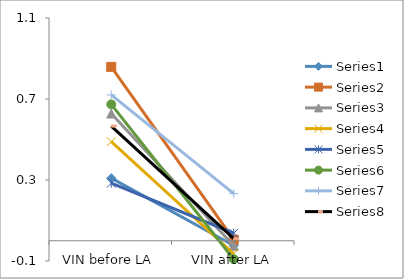
| Category | Series 0 | Series 1 | Series 2 | Series 3 | Series 4 | Series 5 | Series 6 | Series 7 |
|---|---|---|---|---|---|---|---|---|
| VIN before LA | 0.309 | 0.859 | 0.628 | 0.49 | 0.284 | 0.674 | 0.72 | 0.566 |
| VIN after LA | -0.024 | 0.005 | -0.025 | -0.064 | 0.037 | -0.091 | 0.233 | 0.01 |